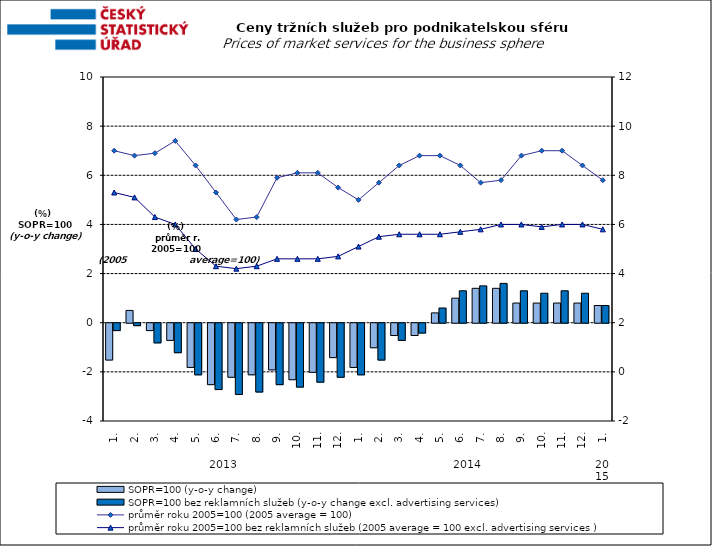
| Category | SOPR=100 (y-o-y change)   | SOPR=100 bez reklamních služeb (y-o-y change excl. advertising services)   |
|---|---|---|
| 0 | -1.5 | -0.3 |
| 1 | 0.5 | -0.1 |
| 2 | -0.3 | -0.8 |
| 3 | -0.7 | -1.2 |
| 4 | -1.8 | -2.1 |
| 5 | -2.5 | -2.7 |
| 6 | -2.2 | -2.9 |
| 7 | -2.1 | -2.8 |
| 8 | -1.9 | -2.5 |
| 9 | -2.3 | -2.6 |
| 10 | -2 | -2.4 |
| 11 | -1.4 | -2.2 |
| 12 | -1.8 | -2.1 |
| 13 | -1 | -1.5 |
| 14 | -0.5 | -0.7 |
| 15 | -0.5 | -0.4 |
| 16 | 0.4 | 0.6 |
| 17 | 1 | 1.3 |
| 18 | 1.4 | 1.5 |
| 19 | 1.4 | 1.6 |
| 20 | 0.8 | 1.3 |
| 21 | 0.8 | 1.2 |
| 22 | 0.8 | 1.3 |
| 23 | 0.8 | 1.2 |
| 24 | 0.7 | 0.7 |